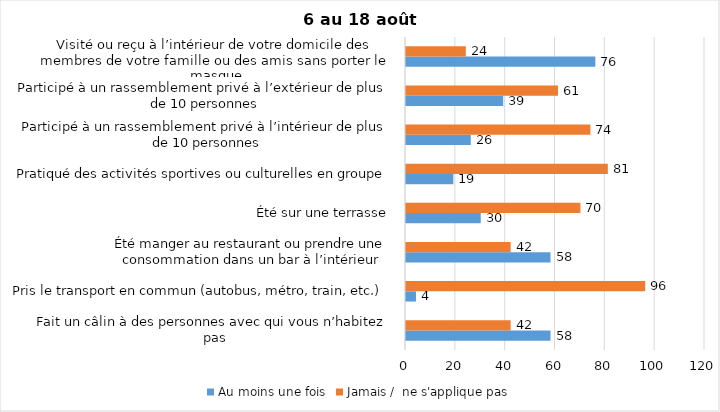
| Category | Au moins une fois | Jamais /  ne s'applique pas |
|---|---|---|
| Fait un câlin à des personnes avec qui vous n’habitez pas | 58 | 42 |
| Pris le transport en commun (autobus, métro, train, etc.) | 4 | 96 |
| Été manger au restaurant ou prendre une consommation dans un bar à l’intérieur | 58 | 42 |
| Été sur une terrasse | 30 | 70 |
| Pratiqué des activités sportives ou culturelles en groupe | 19 | 81 |
| Participé à un rassemblement privé à l’intérieur de plus de 10 personnes | 26 | 74 |
| Participé à un rassemblement privé à l’extérieur de plus de 10 personnes | 39 | 61 |
| Visité ou reçu à l’intérieur de votre domicile des membres de votre famille ou des amis sans porter le masque | 76 | 24 |